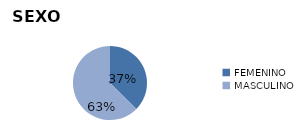
| Category | Series 0 |
|---|---|
| FEMENINO | 1125 |
| MASCULINO | 1887 |